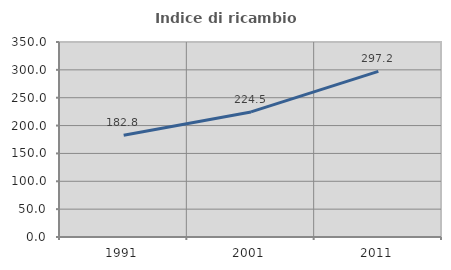
| Category | Indice di ricambio occupazionale  |
|---|---|
| 1991.0 | 182.796 |
| 2001.0 | 224.528 |
| 2011.0 | 297.248 |